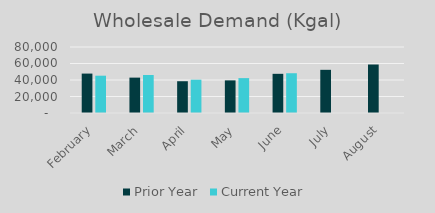
| Category | Prior Year | Current Year |
|---|---|---|
| February | 47777 | 45213 |
| March | 42881 | 46053 |
| April | 38510 | 40390 |
| May | 39535 | 42282 |
| June | 47488 | 48210 |
| July | 52336 | 0 |
| August | 58778 | 0 |